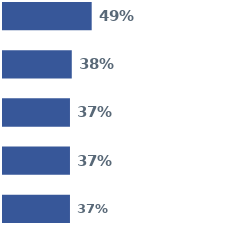
| Category | Series 0 | Series 1 | Series 2 | Series 3 | Series 4 |
|---|---|---|---|---|---|
| 0 | 0.49 | 0.38 | 0.37 | 0.37 | 0.37 |